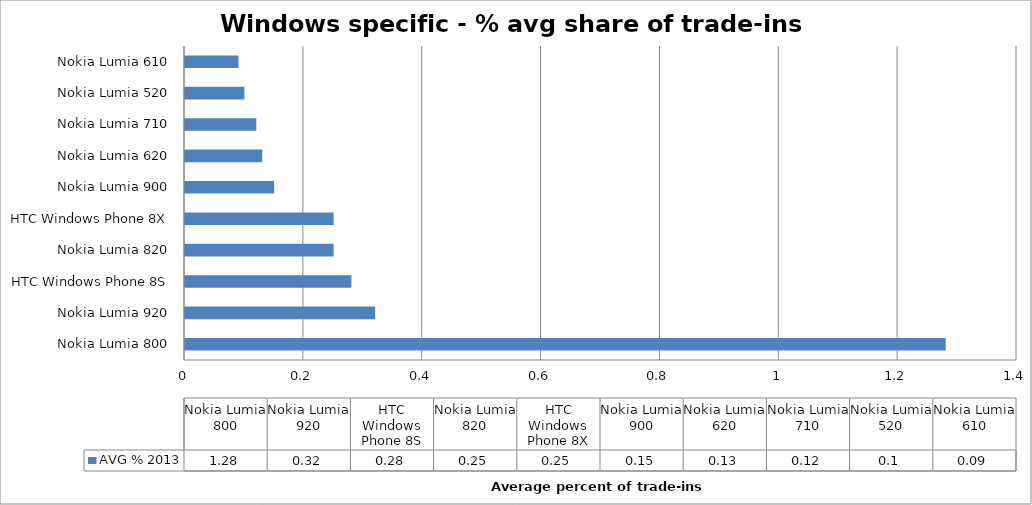
| Category | AVG % 2013 |
|---|---|
| Nokia Lumia 800 | 1.28 |
| Nokia Lumia 920 | 0.32 |
| HTC Windows Phone 8S | 0.28 |
| Nokia Lumia 820 | 0.25 |
| HTC Windows Phone 8X | 0.25 |
| Nokia Lumia 900 | 0.15 |
| Nokia Lumia 620 | 0.13 |
| Nokia Lumia 710 | 0.12 |
| Nokia Lumia 520 | 0.1 |
| Nokia Lumia 610 | 0.09 |